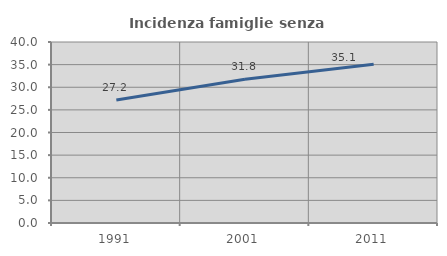
| Category | Incidenza famiglie senza nuclei |
|---|---|
| 1991.0 | 27.2 |
| 2001.0 | 31.781 |
| 2011.0 | 35.065 |